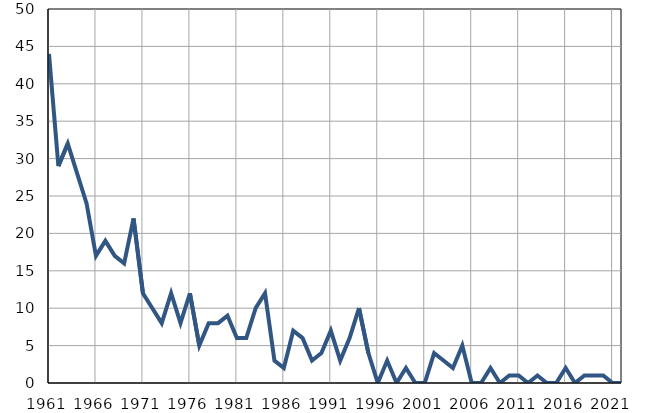
| Category | Умрла 
одојчад |
|---|---|
| 1961.0 | 44 |
| 1962.0 | 29 |
| 1963.0 | 32 |
| 1964.0 | 28 |
| 1965.0 | 24 |
| 1966.0 | 17 |
| 1967.0 | 19 |
| 1968.0 | 17 |
| 1969.0 | 16 |
| 1970.0 | 22 |
| 1971.0 | 12 |
| 1972.0 | 10 |
| 1973.0 | 8 |
| 1974.0 | 12 |
| 1975.0 | 8 |
| 1976.0 | 12 |
| 1977.0 | 5 |
| 1978.0 | 8 |
| 1979.0 | 8 |
| 1980.0 | 9 |
| 1981.0 | 6 |
| 1982.0 | 6 |
| 1983.0 | 10 |
| 1984.0 | 12 |
| 1985.0 | 3 |
| 1986.0 | 2 |
| 1987.0 | 7 |
| 1988.0 | 6 |
| 1989.0 | 3 |
| 1990.0 | 4 |
| 1991.0 | 7 |
| 1992.0 | 3 |
| 1993.0 | 6 |
| 1994.0 | 10 |
| 1995.0 | 4 |
| 1996.0 | 0 |
| 1997.0 | 3 |
| 1998.0 | 0 |
| 1999.0 | 2 |
| 2000.0 | 0 |
| 2001.0 | 0 |
| 2002.0 | 4 |
| 2003.0 | 3 |
| 2004.0 | 2 |
| 2005.0 | 5 |
| 2006.0 | 0 |
| 2007.0 | 0 |
| 2008.0 | 2 |
| 2009.0 | 0 |
| 2010.0 | 1 |
| 2011.0 | 1 |
| 2012.0 | 0 |
| 2013.0 | 1 |
| 2014.0 | 0 |
| 2015.0 | 0 |
| 2016.0 | 2 |
| 2017.0 | 0 |
| 2018.0 | 1 |
| 2019.0 | 1 |
| 2020.0 | 1 |
| 2021.0 | 0 |
| 2022.0 | 0 |